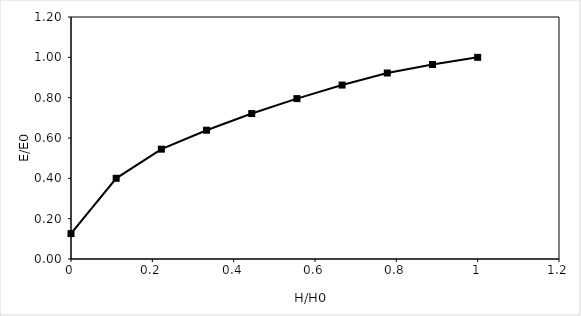
| Category | Head (feet) |
|---|---|
| 1.0 | 1 |
| 0.888888888888889 | 0.964 |
| 0.7777777777777778 | 0.922 |
| 0.6666666666666666 | 0.863 |
| 0.5555555555555556 | 0.795 |
| 0.4444444444444445 | 0.721 |
| 0.33333333333333337 | 0.639 |
| 0.2222222222222223 | 0.545 |
| 0.11111111111111122 | 0.4 |
| 0.0 | 0.126 |